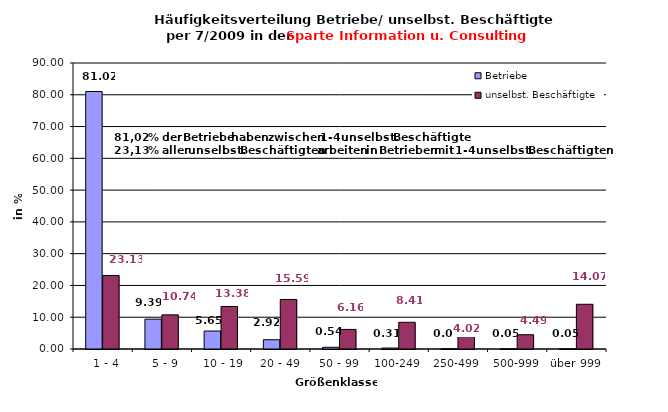
| Category | Betriebe | unselbst. Beschäftigte |
|---|---|---|
|   1 - 4 | 81.022 | 23.13 |
|   5 - 9 | 9.395 | 10.74 |
|  10 - 19 | 5.651 | 13.38 |
| 20 - 49 | 2.92 | 15.588 |
| 50 - 99 | 0.542 | 6.162 |
| 100-249 | 0.306 | 8.407 |
| 250-499 | 0.071 | 4.025 |
| 500-999 | 0.047 | 4.495 |
| über 999 | 0.047 | 14.074 |